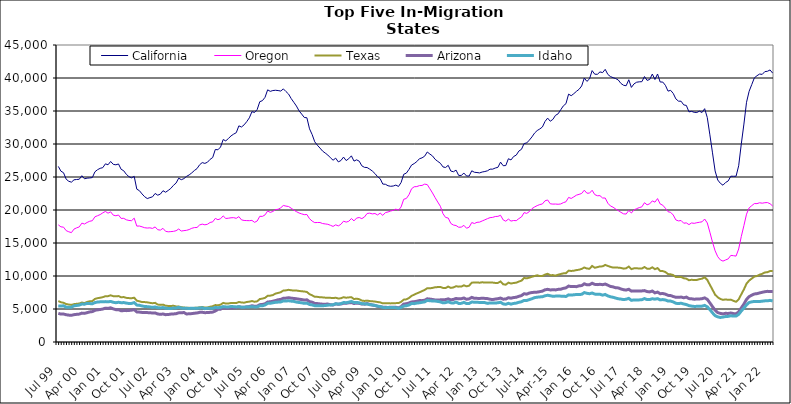
| Category | California | Oregon | Texas | Arizona | Idaho |
|---|---|---|---|---|---|
| Jul 99 | 26605 | 17749 | 6209 | 4339 | 5471 |
| Aug 99 | 25882 | 17447 | 6022 | 4228 | 5444 |
| Sep 99 | 25644 | 17401 | 5941 | 4237 | 5488 |
| Oct 99 | 24669 | 16875 | 5751 | 4134 | 5279 |
| Nov 99 | 24353 | 16701 | 5680 | 4073 | 5260 |
| Dec 99 | 24218 | 16570 | 5619 | 4042 | 5269 |
| Jan 00 | 24574 | 17109 | 5736 | 4142 | 5485 |
| Feb 00 | 24620 | 17295 | 5789 | 4192 | 5530 |
| Mar 00 | 24655 | 17436 | 5826 | 4226 | 5590 |
| Apr 00 | 25195 | 18009 | 5980 | 4375 | 5748 |
| May 00 | 24730 | 17875 | 5897 | 4337 | 5729 |
| Jun 00 | 24825 | 18113 | 6070 | 4444 | 5853 |
| Jul 00 | 24857 | 18294 | 6163 | 4555 | 5824 |
| Aug 00 | 24913 | 18376 | 6199 | 4603 | 5788 |
| Sep 00 | 25792 | 18971 | 6529 | 4804 | 5976 |
| Oct 00 | 26106 | 19135 | 6643 | 4870 | 6058 |
| Nov 00 | 26315 | 19306 | 6705 | 4926 | 6085 |
| Dec 00 | 26415 | 19570 | 6793 | 4991 | 6096 |
| Jan 01 | 26995 | 19781 | 6942 | 5122 | 6119 |
| Feb 01 | 26851 | 19519 | 6948 | 5089 | 6090 |
| Mar 01 | 27352 | 19720 | 7080 | 5180 | 6143 |
| Apr 01 | 26918 | 19221 | 6943 | 5020 | 6020 |
| May 01 | 26848 | 19126 | 6924 | 4899 | 5950 |
| Jun 01 | 26974 | 19241 | 6959 | 4895 | 6019 |
| Jul 01 | 26172 | 18725 | 6778 | 4737 | 5951 |
| Aug 01 | 25943 | 18736 | 6810 | 4757 | 5973 |
| Sep 01 | 25399 | 18514 | 6688 | 4753 | 5895 |
| Oct 01 | 25050 | 18415 | 6650 | 4780 | 5833 |
| Nov 01 | 24873 | 18381 | 6631 | 4826 | 5850 |
| Dec 01 | 25099 | 18765 | 6708 | 4898 | 5969 |
| Jan 02 | 23158 | 17561 | 6261 | 4560 | 5595 |
| Feb 02 | 22926 | 17573 | 6162 | 4531 | 5560 |
| Mar 02 | 22433 | 17452 | 6052 | 4481 | 5458 |
| Apr 02 | 22012 | 17314 | 6046 | 4458 | 5380 |
| May 02 | 21733 | 17267 | 6007 | 4452 | 5358 |
| Jun 02 | 21876 | 17298 | 5933 | 4444 | 5315 |
| Jul 02 | 21997 | 17209 | 5873 | 4383 | 5243 |
| Aug 02 | 22507 | 17436 | 5929 | 4407 | 5315 |
| Sep 02 | 22244 | 17010 | 5672 | 4248 | 5192 |
| Oct 02 | 22406 | 16952 | 5625 | 4191 | 5167 |
| Nov 02 | 22922 | 17223 | 5663 | 4242 | 5221 |
| Dec 02 | 22693 | 16770 | 5499 | 4142 | 5120 |
| Jan 03 | 22964 | 16694 | 5463 | 4166 | 5089 |
| Feb 03 | 23276 | 16727 | 5461 | 4226 | 5077 |
| Mar 03 | 23736 | 16766 | 5486 | 4251 | 5145 |
| Apr 03 | 24079 | 16859 | 5389 | 4289 | 5145 |
| May 03 | 24821 | 17117 | 5378 | 4415 | 5254 |
| Jun 03 | 24592 | 16812 | 5273 | 4426 | 5135 |
| Jul 03 | 24754 | 16875 | 5226 | 4466 | 5124 |
| Aug 03 | 25092 | 16922 | 5181 | 4244 | 5100 |
| Sep 03 | 25316 | 17036 | 5181 | 4279 | 5086 |
| Oct 03 | 25622 | 17228 | 5139 | 4301 | 5110 |
| Nov 03 | 25984 | 17335 | 5175 | 4362 | 5091 |
| Dec 03 | 26269 | 17350 | 5189 | 4396 | 5113 |
| Jan 04 | 26852 | 17734 | 5255 | 4492 | 5152 |
| Feb 04 | 27184 | 17860 | 5301 | 4502 | 5183 |
| Mar 04 | 27062 | 17757 | 5227 | 4443 | 5056 |
| Apr 04 | 27238 | 17840 | 5227 | 4461 | 5104 |
| May 04 | 27671 | 18113 | 5345 | 4493 | 5095 |
| Jun 04 | 27949 | 18201 | 5416 | 4532 | 5103 |
| Jul 04 | 29172 | 18727 | 5597 | 4697 | 5231 |
| Aug 04 | 29122 | 18529 | 5561 | 4945 | 5197 |
| Sep 04 | 29542 | 18678 | 5656 | 4976 | 5237 |
| Oct 04 | 30674 | 19108 | 5922 | 5188 | 5363 |
| Nov 04 | 30472 | 18716 | 5823 | 5106 | 5321 |
| Dec 04 | 30831 | 18755 | 5838 | 5135 | 5312 |
| Jan 05 | 31224 | 18823 | 5906 | 5155 | 5374 |
| Feb 05 | 31495 | 18842 | 5898 | 5168 | 5357 |
| Mar 05 | 31714 | 18738 | 5894 | 5212 | 5313 |
| Apr 05 | 32750 | 18998 | 6060 | 5340 | 5350 |
| May 05 | 32575 | 18504 | 5989 | 5269 | 5276 |
| Jun 05 | 32898 | 18414 | 5954 | 5252 | 5271 |
| Jul 05 | 33384 | 18395 | 6062 | 5322 | 5322 |
| Aug 05 | 33964 | 18381 | 6113 | 5375 | 5316 |
| Sep 05 | 34897 | 18426 | 6206 | 5493 | 5362 |
| Oct 05 | 34780 | 18132 | 6100 | 5408 | 5308 |
| Nov 05 | 35223 | 18332 | 6162 | 5434 | 5314 |
| Dec 05 | 36415 | 19047 | 6508 | 5658 | 5487 |
| Jan 06 | 36567 | 19032 | 6576 | 5688 | 5480 |
| Feb 06 | 37074 | 19257 | 6692 | 5792 | 5616 |
| Mar 06 | 38207 | 19845 | 6993 | 6052 | 5850 |
| Apr 06 | 37976 | 19637 | 7024 | 6101 | 5864 |
| May 06 | 38099 | 19781 | 7114 | 6178 | 5943 |
| Jun 06 | 38141 | 20061 | 7331 | 6276 | 6018 |
| Jul 06 | 38097 | 20111 | 7431 | 6399 | 6046 |
| Aug 06 | 38021 | 20333 | 7542 | 6450 | 6064 |
| Sep 06 | 38349 | 20686 | 7798 | 6627 | 6232 |
| Oct 06 | 37947 | 20591 | 7825 | 6647 | 6216 |
| Nov 06 | 37565 | 20526 | 7907 | 6707 | 6244 |
| Dec 06 | 36884 | 20272 | 7840 | 6648 | 6192 |
| Jan 07 | 36321 | 19984 | 7789 | 6597 | 6151 |
| Feb 07 | 35752 | 19752 | 7799 | 6554 | 6048 |
| Mar 07 | 35025 | 19547 | 7737 | 6487 | 5989 |
| Apr 07 | 34534 | 19412 | 7685 | 6430 | 5937 |
| May 07 | 34022 | 19296 | 7654 | 6353 | 5858 |
| Jun 07 | 33974 | 19318 | 7577 | 6390 | 5886 |
| Jul 07 | 32298 | 18677 | 7250 | 6117 | 5682 |
| Aug 07 | 31436 | 18322 | 7070 | 6034 | 5617 |
| Sep 07 | 30331 | 18087 | 6853 | 5847 | 5500 |
| Oct 07 | 29813 | 18108 | 6839 | 5821 | 5489 |
| Nov 07 | 29384 | 18105 | 6777 | 5769 | 5481 |
| Dec 07 | 28923 | 17949 | 6760 | 5733 | 5499 |
| Jan 08 | 28627 | 17890 | 6721 | 5732 | 5521 |
| Feb 08 | 28328 | 17834 | 6719 | 5749 | 5579 |
| Mar 08 | 27911 | 17680 | 6690 | 5650 | 5614 |
| Apr 08 | 27543 | 17512 | 6656 | 5612 | 5635 |
| May 08 | 27856 | 17754 | 6705 | 5774 | 5798 |
| Jun 08 | 27287 | 17589 | 6593 | 5717 | 5745 |
| Jul 08 | 27495 | 17834 | 6623 | 5761 | 5807 |
| Aug 08 | 28018 | 18309 | 6789 | 5867 | 5982 |
| Sep-08 | 27491 | 18164 | 6708 | 5864 | 5954 |
| Oct 08 | 27771 | 18291 | 6755 | 5942 | 6032 |
| Nov 08 | 28206 | 18706 | 6787 | 5970 | 6150 |
| Dec 08 | 27408 | 18353 | 6505 | 5832 | 5975 |
| Jan 09 | 27601 | 18778 | 6569 | 5890 | 5995 |
| Feb 09 | 27394 | 18863 | 6483 | 5845 | 5936 |
| Mar 09 | 26690 | 18694 | 6273 | 5751 | 5806 |
| Apr 09 | 26461 | 18943 | 6222 | 5735 | 5777 |
| May 09 | 26435 | 19470 | 6272 | 5819 | 5767 |
| Jun 09 | 26187 | 19522 | 6199 | 5700 | 5649 |
| Jul 09 | 25906 | 19408 | 6171 | 5603 | 5617 |
| Aug 09 | 25525 | 19469 | 6128 | 5533 | 5540 |
| Sep 09 | 25050 | 19249 | 6059 | 5405 | 5437 |
| Oct 09 | 24741 | 19529 | 6004 | 5349 | 5369 |
| Nov 09 | 23928 | 19187 | 5854 | 5271 | 5248 |
| Dec 09 | 23899 | 19607 | 5886 | 5261 | 5195 |
| Jan 10 | 23676 | 19703 | 5881 | 5232 | 5234 |
| Feb 10 | 23592 | 19845 | 5850 | 5272 | 5236 |
| Mar 10 | 23634 | 19946 | 5864 | 5278 | 5219 |
| Apr 10 | 23774 | 20134 | 5889 | 5257 | 5201 |
| May 10 | 23567 | 19966 | 5897 | 5172 | 5105 |
| Jun 10 | 24166 | 20464 | 6087 | 5356 | 5237 |
| Jul 10 | 25410 | 21627 | 6417 | 5742 | 5452 |
| Aug 10 | 25586 | 21744 | 6465 | 5797 | 5491 |
| Sep 10 | 26150 | 22314 | 6667 | 5907 | 5609 |
| Oct 10 | 26807 | 23219 | 6986 | 6070 | 5831 |
| Nov 10 | 27033 | 23520 | 7179 | 6100 | 5810 |
| Dec 10 | 27332 | 23551 | 7361 | 6182 | 5898 |
| Jan 11 | 27769 | 23697 | 7525 | 6276 | 5938 |
| Feb 11 | 27898 | 23718 | 7708 | 6267 | 6016 |
| Mar 11 | 28155 | 23921 | 7890 | 6330 | 6081 |
| Apr 11 | 28790 | 23847 | 8146 | 6544 | 6305 |
| May 11 | 28471 | 23215 | 8131 | 6502 | 6248 |
| Jun 11 | 28191 | 22580 | 8199 | 6445 | 6217 |
| Jul 11 | 27678 | 21867 | 8291 | 6368 | 6202 |
| Aug 11 | 27372 | 21203 | 8321 | 6356 | 6146 |
| Sep 11 | 27082 | 20570 | 8341 | 6387 | 6075 |
| Oct 11 | 26528 | 19442 | 8191 | 6402 | 5932 |
| Nov 11 | 26440 | 18872 | 8176 | 6426 | 5968 |
| Dec 11 | 26770 | 18784 | 8401 | 6533 | 6106 |
| Jan 12 | 25901 | 17963 | 8202 | 6390 | 5933 |
| Feb 12 | 25796 | 17718 | 8266 | 6456 | 5900 |
| Mar 12 | 26042 | 17647 | 8456 | 6600 | 6054 |
| Apr 12 | 25239 | 17386 | 8388 | 6534 | 5838 |
| May 12 | 25238 | 17407 | 8401 | 6558 | 5854 |
| Jun 12 | 25593 | 17673 | 8594 | 6669 | 6009 |
| Jul 12 | 25155 | 17237 | 8432 | 6474 | 5817 |
| Aug 12 | 25146 | 17391 | 8536 | 6539 | 5842 |
| Sep 12 | 25942 | 18102 | 8989 | 6759 | 6061 |
| Oct 12 | 25718 | 17953 | 9012 | 6618 | 6027 |
| Nov 12 | 25677 | 18134 | 9032 | 6611 | 6009 |
| Dec 12 | 25619 | 18166 | 8981 | 6601 | 5999 |
| Jan 13 | 25757 | 18344 | 9051 | 6627 | 5989 |
| Feb-13 | 25830 | 18512 | 9001 | 6606 | 5968 |
| Mar-13 | 25940 | 18689 | 9021 | 6577 | 5853 |
| Apr 13 | 26187 | 18844 | 9013 | 6478 | 5925 |
| May 13 | 26192 | 18884 | 9003 | 6431 | 5924 |
| Jun-13 | 26362 | 19013 | 8948 | 6508 | 5896 |
| Jul 13 | 26467 | 19037 | 8958 | 6559 | 5948 |
| Aug 13 | 27253 | 19198 | 9174 | 6655 | 6020 |
| Sep 13 | 26711 | 18501 | 8747 | 6489 | 5775 |
| Oct 13 | 26733 | 18301 | 8681 | 6511 | 5711 |
| Nov 13 | 27767 | 18620 | 8989 | 6709 | 5860 |
| Dec 13 | 27583 | 18320 | 8863 | 6637 | 5740 |
| Jan 14 | 28107 | 18409 | 8939 | 6735 | 5843 |
| Feb-14 | 28313 | 18383 | 8989 | 6779 | 5893 |
| Mar 14 | 28934 | 18696 | 9160 | 6918 | 6015 |
| Apr 14 | 29192 | 18946 | 9291 | 7036 | 6099 |
| May 14 | 30069 | 19603 | 9701 | 7314 | 6304 |
| Jun 14 | 30163 | 19487 | 9641 | 7252 | 6293 |
| Jul-14 | 30587 | 19754 | 9752 | 7415 | 6427 |
| Aug-14 | 31074 | 20201 | 9882 | 7499 | 6557 |
| Sep 14 | 31656 | 20459 | 9997 | 7536 | 6719 |
| Oct 14 | 32037 | 20663 | 10109 | 7555 | 6786 |
| Nov 14 | 32278 | 20825 | 9992 | 7628 | 6831 |
| Dec 14 | 32578 | 20918 | 10006 | 7705 | 6860 |
| Jan 15 | 33414 | 21396 | 10213 | 7906 | 7000 |
| Feb 15 | 33922 | 21518 | 10337 | 7982 | 7083 |
| Mar 15 | 33447 | 20942 | 10122 | 7891 | 7006 |
| Apr-15 | 33731 | 20893 | 10138 | 7906 | 6931 |
| May 15 | 34343 | 20902 | 10053 | 7895 | 6952 |
| Jun-15 | 34572 | 20870 | 10192 | 7973 | 6966 |
| Jul 15 | 35185 | 20916 | 10303 | 8000 | 6949 |
| Aug 15 | 35780 | 21115 | 10399 | 8126 | 6938 |
| Sep 15 | 36109 | 21246 | 10428 | 8207 | 6896 |
| Oct 15 | 37555 | 21908 | 10813 | 8477 | 7140 |
| Nov 15 | 37319 | 21750 | 10763 | 8390 | 7112 |
| Dec 15 | 37624 | 21990 | 10807 | 8395 | 7149 |
| Jan 16 | 37978 | 22248 | 10892 | 8388 | 7201 |
| Feb 16 | 38285 | 22369 | 10951 | 8508 | 7192 |
| Mar 16 | 38792 | 22506 | 11075 | 8547 | 7226 |
| Apr 16 | 39994 | 22999 | 11286 | 8815 | 7487 |
| May 16 | 39488 | 22548 | 11132 | 8673 | 7382 |
| Jun 16 | 39864 | 22556 | 11100 | 8682 | 7315 |
| Jul 16 | 41123 | 22989 | 11516 | 8903 | 7420 |
| Aug 16 | 40573 | 22333 | 11251 | 8731 | 7261 |
| Sep 16 | 40560 | 22162 | 11340 | 8692 | 7216 |
| Oct 16 | 40923 | 22172 | 11456 | 8742 | 7233 |
| Nov 16 | 40817 | 21818 | 11459 | 8685 | 7101 |
| Dec 16 | 41311 | 21815 | 11681 | 8783 | 7203 |
| Jan 17 | 40543 | 21029 | 11524 | 8609 | 6982 |
| Feb 17 | 40218 | 20613 | 11385 | 8416 | 6852 |
| Mar 17 | 40052 | 20425 | 11276 | 8354 | 6775 |
| Apr 17 | 39913 | 20147 | 11297 | 8218 | 6653 |
| May 17 | 39695 | 19910 | 11265 | 8196 | 6552 |
| Jun 17 | 39177 | 19650 | 11225 | 8034 | 6500 |
| Jul 17 | 38901 | 19419 | 11115 | 7923 | 6429 |
| Aug 17 | 38827 | 19389 | 11168 | 7867 | 6479 |
| Sep 17 | 39736 | 19936 | 11426 | 7991 | 6609 |
| Oct 17 | 38576 | 19547 | 11041 | 7708 | 6315 |
| Nov 17 | 39108 | 20013 | 11158 | 7746 | 6381 |
| Dec 17 | 39359 | 20202 | 11185 | 7743 | 6366 |
| Jan 18 | 39420 | 20362 | 11118 | 7736 | 6380 |
| Feb 18 | 39440 | 20476 | 11128 | 7741 | 6407 |
| Mar 18 | 40218 | 21106 | 11362 | 7789 | 6578 |
| Apr 18 | 39637 | 20788 | 11111 | 7642 | 6423 |
| May 18 | 39777 | 20933 | 11097 | 7591 | 6430 |
| Jun 18 | 40602 | 21381 | 11317 | 7721 | 6554 |
| Jul 18 | 39767 | 21189 | 11038 | 7445 | 6489 |
| Aug 18 | 40608 | 21729 | 11200 | 7560 | 6569 |
| Sep 18 | 39395 | 20916 | 10772 | 7318 | 6383 |
| Oct 18 | 39383 | 20724 | 10740 | 7344 | 6429 |
| Nov 18 | 38891 | 20265 | 10605 | 7255 | 6365 |
| Dec 18 | 38013 | 19741 | 10292 | 7069 | 6205 |
| Jan 19 | 38130 | 19643 | 10261 | 7032 | 6203 |
| Feb 19 | 37658 | 19237 | 10132 | 6892 | 6073 |
| Mar 19 | 36831 | 18492 | 9848 | 6766 | 5863 |
| Apr 19 | 36492 | 18349 | 9839 | 6763 | 5827 |
| May 19 | 36481 | 18407 | 9867 | 6809 | 5873 |
| Jun 19 | 35925 | 17998 | 9661 | 6698 | 5761 |
| Jul 19 | 35843 | 18049 | 9598 | 6800 | 5673 |
| Aug 19 | 34870 | 17785 | 9361 | 6577 | 5512 |
| Sep 19 | 34945 | 18038 | 9428 | 6547 | 5437 |
| Oct 19 | 34802 | 17977 | 9385 | 6483 | 5390 |
| Nov 19 | 34775 | 18072 | 9403 | 6511 | 5401 |
| Dec 19 | 34976 | 18140 | 9518 | 6521 | 5419 |
| Jan 20 | 34774 | 18209 | 9594 | 6561 | 5434 |
| Feb 20 | 35352 | 18632 | 9804 | 6682 | 5543 |
| Mar 20 | 34013 | 18041 | 9411 | 6464 | 5330 |
| Apr 20 | 31385 | 16629 | 8666 | 5922 | 4906 |
| May 20 | 28657 | 15123 | 7927 | 5355 | 4419 |
| Jun 20 | 25915 | 13817 | 7164 | 4815 | 3992 |
| Jul 20 | 24545 | 12926 | 6776 | 4457 | 3810 |
| Aug 20 | 24048 | 12443 | 6521 | 4326 | 3720 |
| Sep 20 | 23756 | 12258 | 6386 | 4266 | 3784 |
| Oct 20 | 24166 | 12429 | 6452 | 4347 | 3861 |
| Nov 20 | 24404 | 12597 | 6386 | 4324 | 3883 |
| Dec 20 | 25120 | 13122 | 6420 | 4394 | 3974 |
| Jan 21 | 25111 | 13080 | 6236 | 4304 | 3924 |
| Feb 21 | 25114 | 13015 | 6094 | 4260 | 3930 |
| Mar 21 | 26701 | 14096 | 6455 | 4567 | 4185 |
| Apr 21 | 29998 | 15978 | 7222 | 5164 | 4697 |
| May 21 | 33020 | 17641 | 7969 | 5748 | 5148 |
| Jun 21 | 36320 | 19369 | 8840 | 6450 | 5628 |
| Jul 21 | 37989 | 20320 | 9306 | 6877 | 5984 |
| Aug 21 | 39007 | 20657 | 9615 | 7094 | 6084 |
| Sep 21 | 40023 | 20974 | 9914 | 7277 | 6151 |
| Oct 21 | 40348 | 20966 | 10003 | 7327 | 6140 |
| Nov 21 | 40599 | 21096 | 10203 | 7437 | 6136 |
| Dec 21 | 40548 | 21032 | 10328 | 7532 | 6183 |
| Jan 22 | 40967 | 21106 | 10535 | 7618 | 6237 |
| Feb 22 | 41019 | 21125 | 10579 | 7673 | 6236 |
| Mar 22 | 41220 | 20949 | 10751 | 7660 | 6310 |
| Apr 22 | 40730 | 20602 | 10772 | 7661 | 6221 |